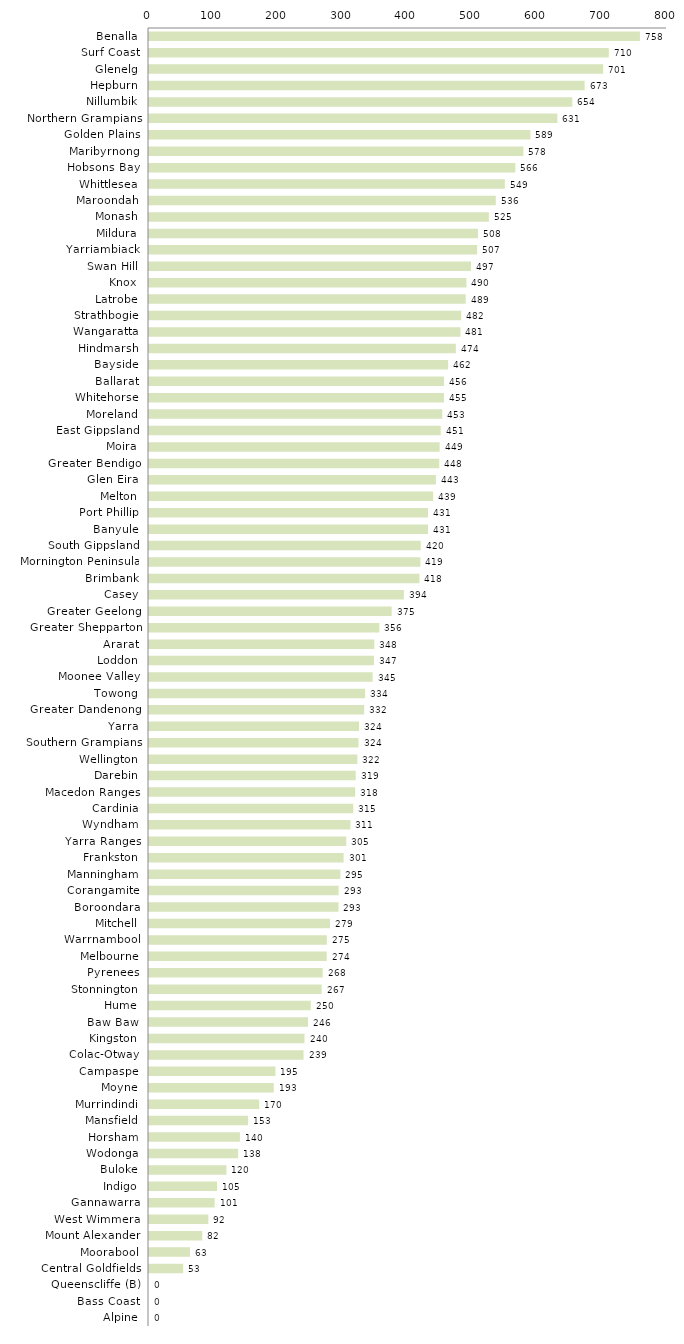
| Category | Series 0 |
|---|---|
| Benalla | 758.186 |
| Surf Coast | 710.07 |
| Glenelg | 701.279 |
| Hepburn | 672.722 |
| Nillumbik | 653.73 |
| Northern Grampians | 630.635 |
| Golden Plains | 589.018 |
| Maribyrnong | 578.144 |
| Hobsons Bay | 565.752 |
| Whittlesea | 549.487 |
| Maroondah | 535.542 |
| Monash | 524.863 |
| Mildura | 508.029 |
| Yarriambiack | 506.749 |
| Swan Hill | 497.195 |
| Knox | 490.233 |
| Latrobe | 489.127 |
| Strathbogie | 482.16 |
| Wangaratta | 481 |
| Hindmarsh | 473.809 |
| Bayside | 461.956 |
| Ballarat | 455.532 |
| Whitehorse | 455.477 |
| Moreland | 452.913 |
| East Gippsland | 450.592 |
| Moira | 448.803 |
| Greater Bendigo | 448.268 |
| Glen Eira | 443.059 |
| Melton | 438.88 |
| Port Phillip | 430.851 |
| Banyule | 430.797 |
| South Gippsland | 419.618 |
| Mornington Peninsula | 419.132 |
| Brimbank | 417.654 |
| Casey | 393.607 |
| Greater Geelong | 374.774 |
| Greater Shepparton | 355.691 |
| Ararat | 347.947 |
| Loddon | 347.406 |
| Moonee Valley | 345.325 |
| Towong | 333.714 |
| Greater Dandenong | 332.339 |
| Yarra | 324.331 |
| Southern Grampians | 323.583 |
| Wellington | 321.738 |
| Darebin | 319.276 |
| Macedon Ranges | 318.345 |
| Cardinia | 315.497 |
| Wyndham | 311.05 |
| Yarra Ranges | 304.68 |
| Frankston | 300.549 |
| Manningham | 295.477 |
| Corangamite | 292.803 |
| Boroondara | 292.641 |
| Mitchell | 279.462 |
| Warrnambool | 274.649 |
| Melbourne | 274.496 |
| Pyrenees | 268.224 |
| Stonnington | 266.576 |
| Hume | 249.826 |
| Baw Baw | 245.557 |
| Kingston | 240.189 |
| Colac-Otway | 238.658 |
| Campaspe | 195.224 |
| Moyne | 192.629 |
| Murrindindi | 170.15 |
| Mansfield | 153.071 |
| Horsham | 140.377 |
| Wodonga | 137.65 |
| Buloke | 119.554 |
| Indigo | 105.029 |
| Gannawarra | 101.289 |
| West Wimmera | 91.608 |
| Mount Alexander | 82.24 |
| Moorabool | 63.186 |
| Central Goldfields | 52.78 |
| Queenscliffe (B) | 0 |
| Bass Coast | 0 |
| Alpine | 0 |